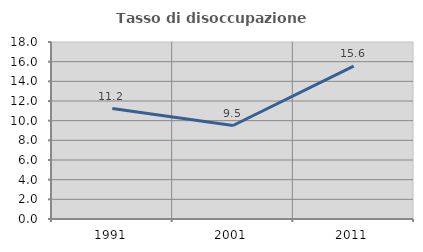
| Category | Tasso di disoccupazione giovanile  |
|---|---|
| 1991.0 | 11.237 |
| 2001.0 | 9.506 |
| 2011.0 | 15.556 |